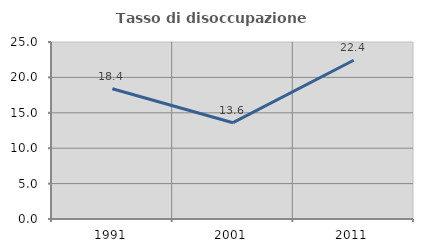
| Category | Tasso di disoccupazione giovanile  |
|---|---|
| 1991.0 | 18.393 |
| 2001.0 | 13.603 |
| 2011.0 | 22.424 |